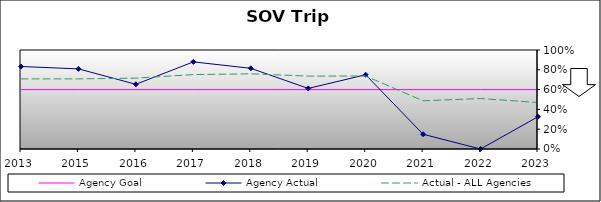
| Category | Agency Goal | Agency Actual | Actual - ALL Agencies |
|---|---|---|---|
| 2013.0 | 0.6 | 0.833 | 0.708 |
| 2015.0 | 0.6 | 0.809 | 0.708 |
| 2016.0 | 0.6 | 0.654 | 0.716 |
| 2017.0 | 0.6 | 0.88 | 0.752 |
| 2018.0 | 0.6 | 0.815 | 0.759 |
| 2019.0 | 0.6 | 0.612 | 0.736 |
| 2020.0 | 0.6 | 0.75 | 0.737 |
| 2021.0 | 0.6 | 0.149 | 0.487 |
| 2022.0 | 0.6 | 0 | 0.509 |
| 2023.0 | 0.6 | 0.326 | 0.47 |